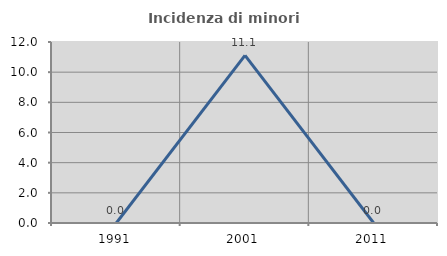
| Category | Incidenza di minori stranieri |
|---|---|
| 1991.0 | 0 |
| 2001.0 | 11.111 |
| 2011.0 | 0 |